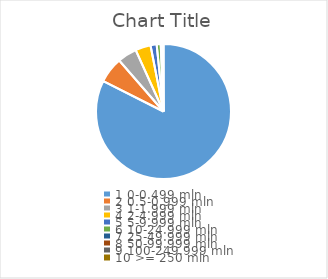
| Category | Series 0 |
|---|---|
| 0 | 1675789 |
| 1 | 125614 |
| 2 | 93810 |
| 3 | 74671 |
| 4 | 29800 |
| 5 | 19576 |
| 6 | 6789 |
| 7 | 3571 |
| 8 | 1990 |
| 9 | 1104 |